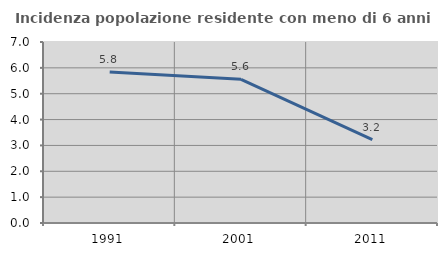
| Category | Incidenza popolazione residente con meno di 6 anni |
|---|---|
| 1991.0 | 5.841 |
| 2001.0 | 5.556 |
| 2011.0 | 3.226 |